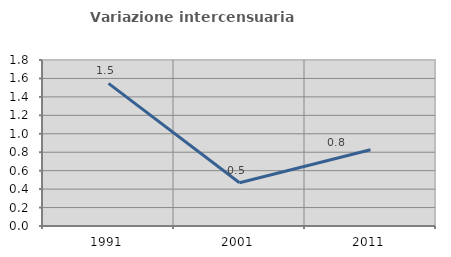
| Category | Variazione intercensuaria annua |
|---|---|
| 1991.0 | 1.547 |
| 2001.0 | 0.47 |
| 2011.0 | 0.827 |